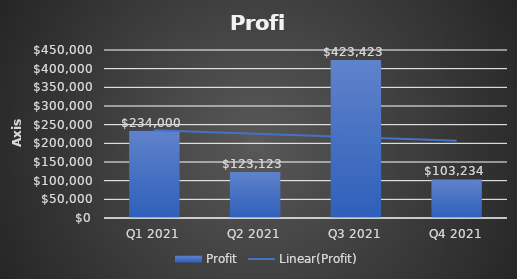
| Category | Profit |
|---|---|
| Q1 2021 | 234000 |
| Q2 2021 | 123123 |
| Q3 2021 | 423423 |
| Q4 2021 | 103234 |